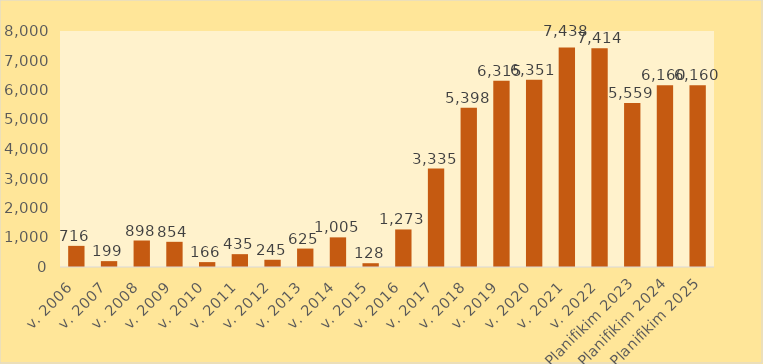
| Category | Vlera në Milion lekë |
|---|---|
| v. 2006 | 716.061 |
| v. 2007 | 199.081 |
| v. 2008 | 898.015 |
| v. 2009 | 853.767 |
| v. 2010 | 165.841 |
| v. 2011 | 435.47 |
| v. 2012 | 245.071 |
| v. 2013 | 624.719 |
| v. 2014 | 1004.843 |
| v. 2015 | 128.325 |
| v. 2016 | 1272.832 |
| v. 2017 | 3334.883 |
| v. 2018 | 5398.329 |
| v. 2019 | 6315.307 |
| v. 2020 | 6350.959 |
| v. 2021 | 7438.142 |
| v. 2022 | 7414.036 |
| Planifikim 2023 | 5559 |
| Planifikim 2024 | 6160 |
| Planifikim 2025 | 6160 |